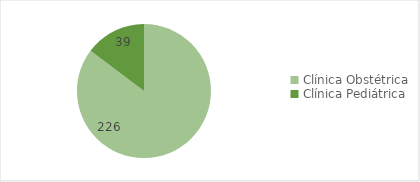
| Category | Series 0 |
|---|---|
| Clínica Obstétrica | 226 |
| Clínica Pediátrica  | 39 |